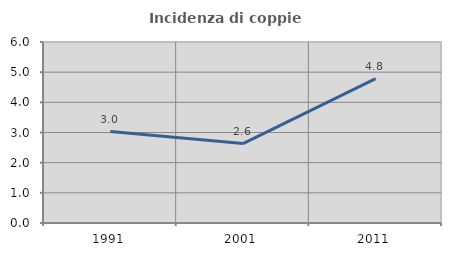
| Category | Incidenza di coppie miste |
|---|---|
| 1991.0 | 3.03 |
| 2001.0 | 2.632 |
| 2011.0 | 4.787 |